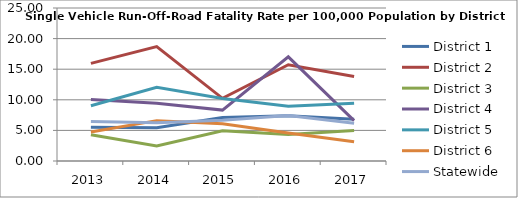
| Category | District 1 | District 2 | District 3 | District 4 | District 5 | District 6 | Statewide |
|---|---|---|---|---|---|---|---|
| 2013.0 | 5.516 | 15.949 | 4.291 | 10.06 | 9.029 | 4.749 | 6.451 |
| 2014.0 | 5.42 | 18.686 | 2.442 | 9.449 | 12.031 | 6.596 | 6.241 |
| 2015.0 | 7.111 | 10.244 | 4.936 | 8.316 | 10.215 | 6.072 | 6.647 |
| 2016.0 | 7.389 | 15.73 | 4.313 | 17.015 | 8.939 | 4.583 | 7.426 |
| 2017.0 | 6.813 | 13.822 | 4.969 | 6.609 | 9.42 | 3.151 | 6.174 |